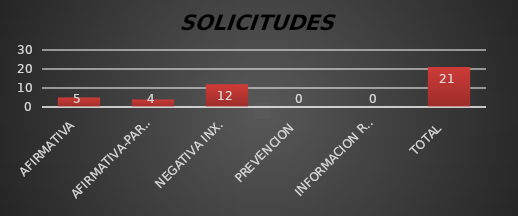
| Category | Series 1 |
|---|---|
| AFIRMATIVA | 5 |
| AFIRMATIVA-PARCIAL | 4 |
| NEGATIVA INX. | 12 |
| PREVENCION  | 0 |
| INFORMACION RESERVADA | 0 |
| TOTAL  | 21 |